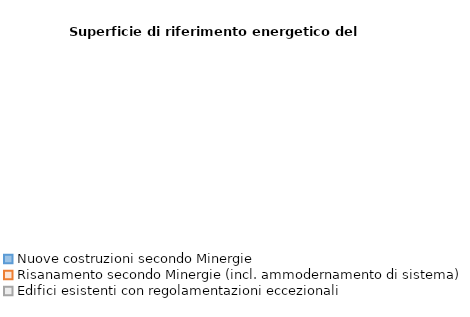
| Category | Series 0 |
|---|---|
| Nuove costruzioni secondo Minergie | 0 |
| Risanamento secondo Minergie (incl. ammodernamento di sistema) | 0 |
| Edifici esistenti con regolamentazioni eccezionali | 0 |